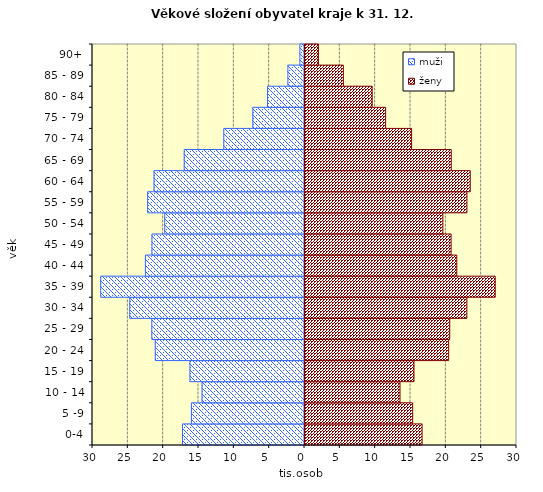
| Category | muži | ženy |
|---|---|---|
| 0-4 | -17266 | 16710 |
|  5 -9 | -16003 | 15380 |
|  10 - 14 | -14494 | 13587 |
| 15 - 19 | -16211 | 15566 |
| 20 - 24 | -21112 | 20472 |
| 25 - 29 | -21603 | 20623 |
| 30 - 34 | -24728 | 23050 |
| 35 - 39 | -28833 | 27061 |
| 40 - 44 | -22512 | 21620 |
| 45 - 49 | -21583 | 20817 |
| 50 - 54 | -19778 | 19654 |
| 55 - 59 | -22201 | 23055 |
| 60 - 64 | -21297 | 23524 |
| 65 - 69 | -17021 | 20839 |
| 70 - 74 | -11417 | 15229 |
| 75 - 79 | -7312 | 11552 |
| 80 - 84 | -5232 | 9649 |
| 85 - 89 | -2350 | 5570 |
| 90+ | -655 | 2043 |